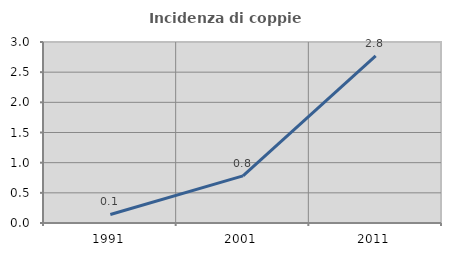
| Category | Incidenza di coppie miste |
|---|---|
| 1991.0 | 0.142 |
| 2001.0 | 0.781 |
| 2011.0 | 2.77 |